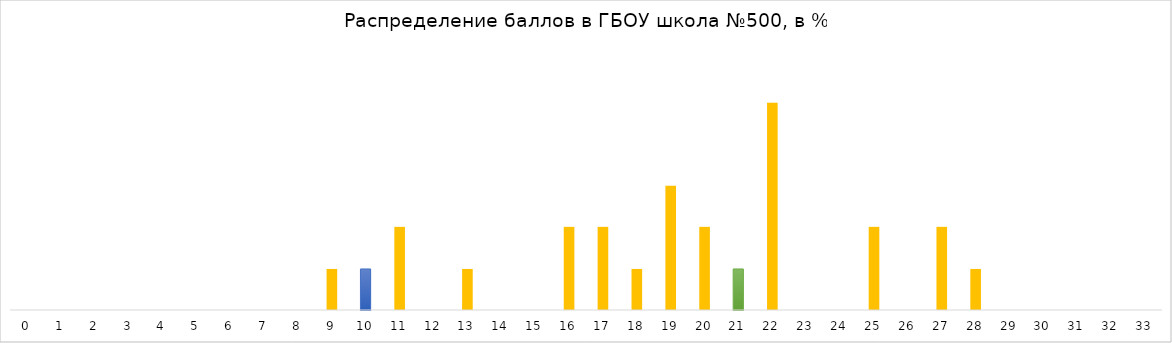
| Category | ГБОУ СОШ №500 |
|---|---|
| 0.0 | 0 |
| 1.0 | 0 |
| 2.0 | 0 |
| 3.0 | 0 |
| 4.0 | 0 |
| 5.0 | 0 |
| 6.0 | 0 |
| 7.0 | 0 |
| 8.0 | 0 |
| 9.0 | 3.8 |
| 10.0 | 3.8 |
| 11.0 | 7.7 |
| 12.0 | 0 |
| 13.0 | 3.8 |
| 14.0 | 0 |
| 15.0 | 0 |
| 16.0 | 7.7 |
| 17.0 | 7.7 |
| 18.0 | 3.8 |
| 19.0 | 11.5 |
| 20.0 | 7.7 |
| 21.0 | 3.8 |
| 22.0 | 19.2 |
| 23.0 | 0 |
| 24.0 | 0 |
| 25.0 | 7.7 |
| 26.0 | 0 |
| 27.0 | 7.7 |
| 28.0 | 3.8 |
| 29.0 | 0 |
| 30.0 | 0 |
| 31.0 | 0 |
| 32.0 | 0 |
| 33.0 | 0 |